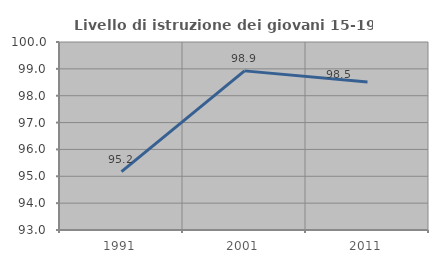
| Category | Livello di istruzione dei giovani 15-19 anni |
|---|---|
| 1991.0 | 95.172 |
| 2001.0 | 98.925 |
| 2011.0 | 98.515 |